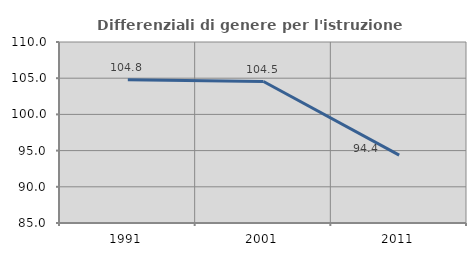
| Category | Differenziali di genere per l'istruzione superiore |
|---|---|
| 1991.0 | 104.79 |
| 2001.0 | 104.537 |
| 2011.0 | 94.368 |